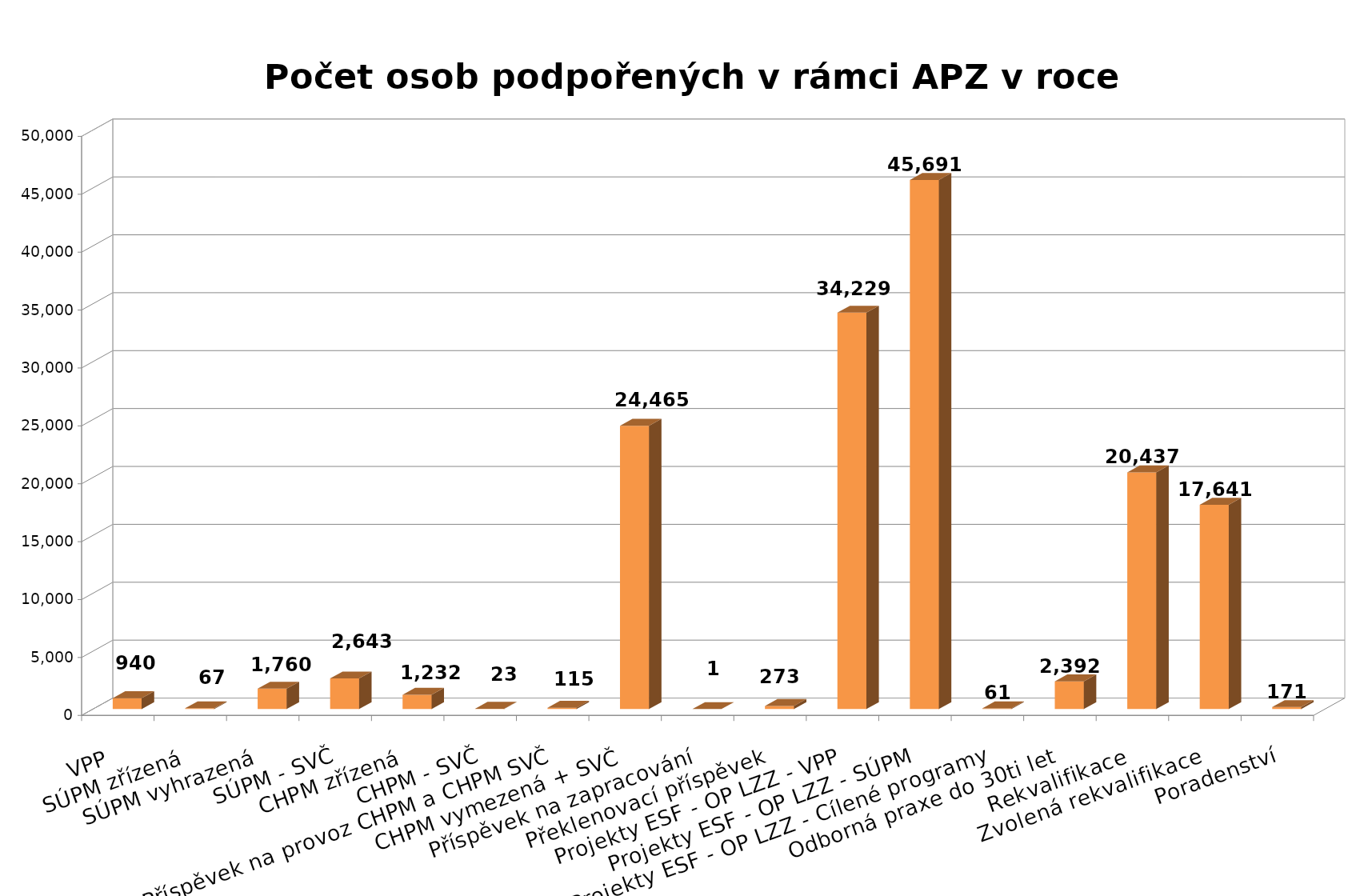
| Category | Series 0 |
|---|---|
| VPP | 940 |
| SÚPM zřízená | 67 |
| SÚPM vyhrazená | 1760 |
| SÚPM - SVČ | 2643 |
| CHPM zřízená | 1232 |
| CHPM - SVČ | 23 |
| Příspěvek na provoz CHPM a CHPM SVČ | 115 |
| CHPM vymezená + SVČ | 24465 |
| Příspěvek na zapracování | 1 |
| Překlenovací příspěvek | 273 |
| Projekty ESF - OP LZZ - VPP | 34229 |
| Projekty ESF - OP LZZ - SÚPM | 45691 |
| Projekty ESF - OP LZZ - Cílené programy | 61 |
| Odborná praxe do 30ti let | 2392 |
| Rekvalifikace | 20437 |
| Zvolená rekvalifikace | 17641 |
| Poradenství | 171 |